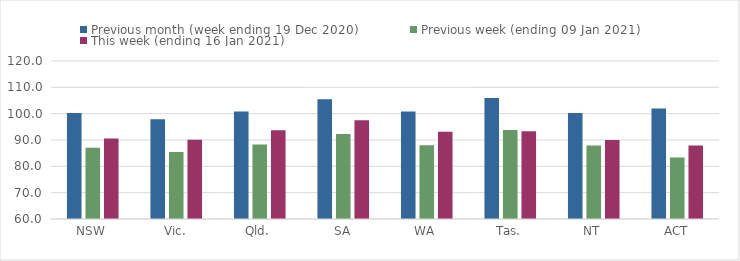
| Category | Previous month (week ending 19 Dec 2020) | Previous week (ending 09 Jan 2021) | This week (ending 16 Jan 2021) |
|---|---|---|---|
| NSW | 100.28 | 87.1 | 90.57 |
| Vic. | 97.9 | 85.42 | 90.06 |
| Qld. | 100.85 | 88.32 | 93.71 |
| SA | 105.43 | 92.32 | 97.51 |
| WA | 100.83 | 88.04 | 93.1 |
| Tas. | 105.96 | 93.79 | 93.31 |
| NT | 100.29 | 87.89 | 89.98 |
| ACT | 101.92 | 83.37 | 87.89 |